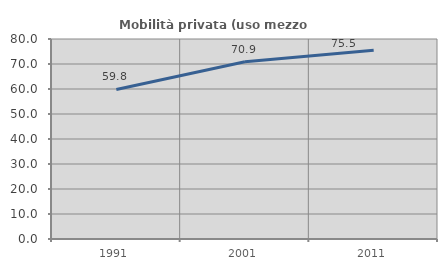
| Category | Mobilità privata (uso mezzo privato) |
|---|---|
| 1991.0 | 59.825 |
| 2001.0 | 70.88 |
| 2011.0 | 75.501 |